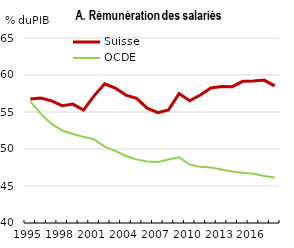
| Category | Suisse | OCDE |
|---|---|---|
| 1995.0 | 56.749 | 56.439 |
| 1996.0 | 56.896 | 54.747 |
| 1997.0 | 56.496 | 53.385 |
| 1998.0 | 55.858 | 52.491 |
| 1999.0 | 56.07 | 52.027 |
| 2000.0 | 55.25 | 51.642 |
| 2001.0 | 57.181 | 51.3 |
| 2002.0 | 58.815 | 50.32 |
| 2003.0 | 58.238 | 49.756 |
| 2004.0 | 57.287 | 49.06 |
| 2005.0 | 56.835 | 48.598 |
| 2006.0 | 55.517 | 48.308 |
| 2007.0 | 54.913 | 48.249 |
| 2008.0 | 55.275 | 48.581 |
| 2009.0 | 57.488 | 48.891 |
| 2010.0 | 56.522 | 47.902 |
| 2011.0 | 57.297 | 47.587 |
| 2012.0 | 58.241 | 47.514 |
| 2013.0 | 58.449 | 47.222 |
| 2014.0 | 58.424 | 46.967 |
| 2015.0 | 59.14 | 46.797 |
| 2016.0 | 59.189 | 46.668 |
| 2017.0 | 59.316 | 46.339 |
| 2018.0 | 58.533 | 46.134 |